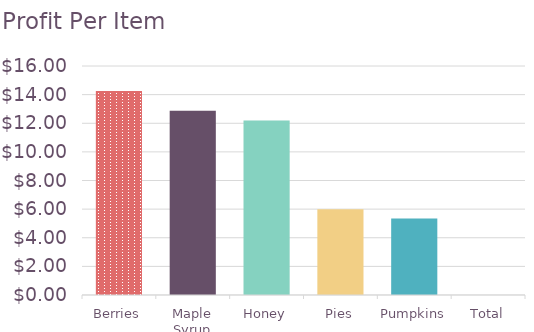
| Category | Profit per Item (incl. shipping) |
|---|---|
| Berries | 14.25 |
| Maple Syrup | 12.875 |
| Honey | 12.2 |
| Pies | 6 |
| Pumpkins | 5.35 |